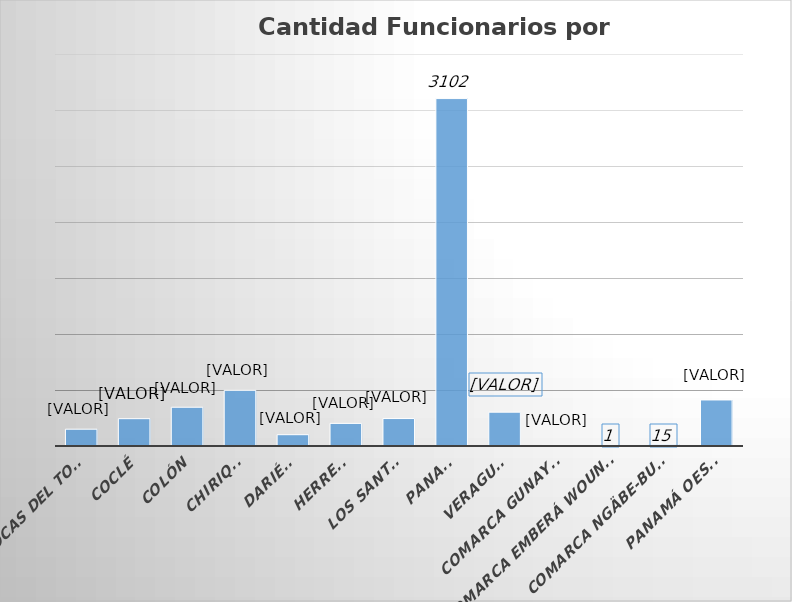
| Category | Cantidad  |
|---|---|
| BOCAS DEL TORO | 150 |
| COCLÉ | 244 |
| COLÓN | 346 |
| CHIRIQUÍ | 497 |
| DARIÉN | 101 |
| HERRERA | 202 |
| LOS SANTOS | 245 |
| PANAMÁ | 3102 |
| VERAGUAS | 302 |
| COMARCA GUNAYALA | 6 |
| COMARCA EMBERÁ WOUNAAN | 1 |
| COMARCA NGÄBE-BUGLÉ | 15 |
| PANAMÁ OESTE | 411 |